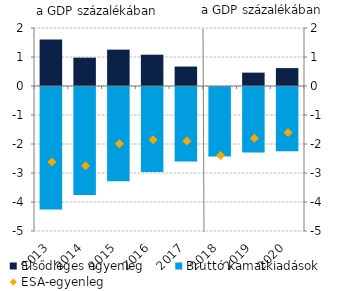
| Category | Elsődleges egyenleg | Bruttó kamatkiadások |
|---|---|---|
| 2013.0 | 1.605 | -4.226 |
| 2014.0 | 0.977 | -3.723 |
| 2015.0 | 1.254 | -3.248 |
| 2016.0 | 1.08 | -2.933 |
| 2017.0 | 0.671 | -2.571 |
| 2018.0 | -0.014 | -2.386 |
| 2019.0 | 0.461 | -2.261 |
| 2020.0 | 0.617 | -2.217 |